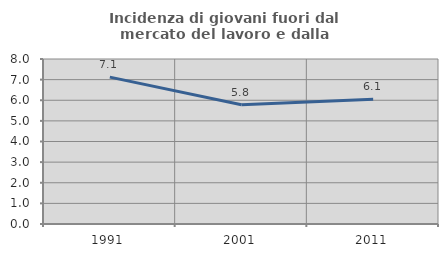
| Category | Incidenza di giovani fuori dal mercato del lavoro e dalla formazione  |
|---|---|
| 1991.0 | 7.122 |
| 2001.0 | 5.786 |
| 2011.0 | 6.054 |